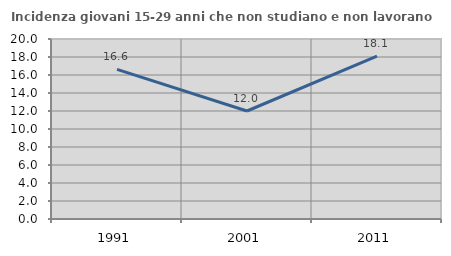
| Category | Incidenza giovani 15-29 anni che non studiano e non lavorano  |
|---|---|
| 1991.0 | 16.627 |
| 2001.0 | 12 |
| 2011.0 | 18.097 |